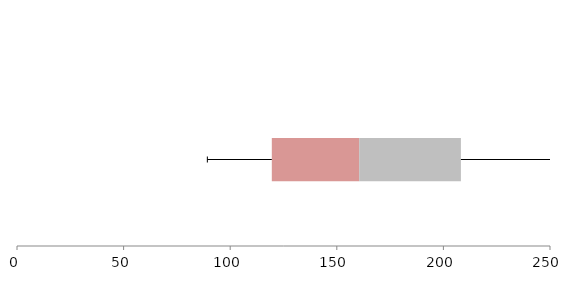
| Category | Series 1 | Series 2 | Series 3 |
|---|---|---|---|
| 0 | 119.518 | 40.981 | 47.709 |